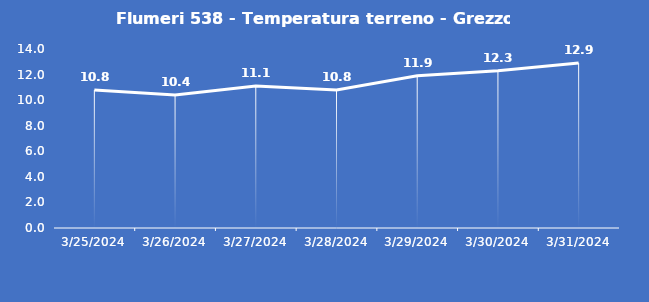
| Category | Flumeri 538 - Temperatura terreno - Grezzo (°C) |
|---|---|
| 3/25/24 | 10.8 |
| 3/26/24 | 10.4 |
| 3/27/24 | 11.1 |
| 3/28/24 | 10.8 |
| 3/29/24 | 11.9 |
| 3/30/24 | 12.3 |
| 3/31/24 | 12.9 |